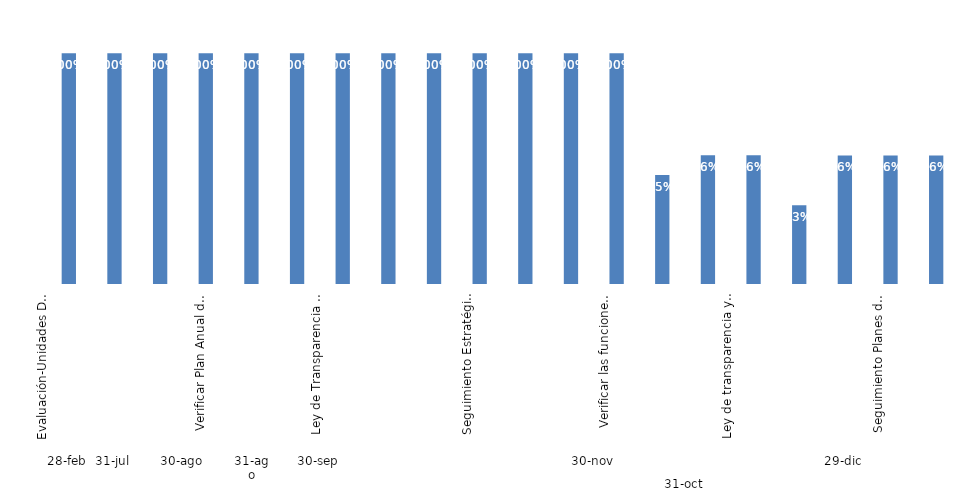
| Category | Total |
|---|---|
| 0 | 1 |
| 1 | 1 |
| 2 | 1 |
| 3 | 1 |
| 4 | 1 |
| 5 | 1 |
| 6 | 1 |
| 7 | 1 |
| 8 | 1 |
| 9 | 1 |
| 10 | 1 |
| 11 | 1 |
| 12 | 1 |
| 13 | 0.947 |
| 14 | 0.956 |
| 15 | 0.956 |
| 16 | 0.934 |
| 17 | 0.956 |
| 18 | 0.956 |
| 19 | 0.956 |